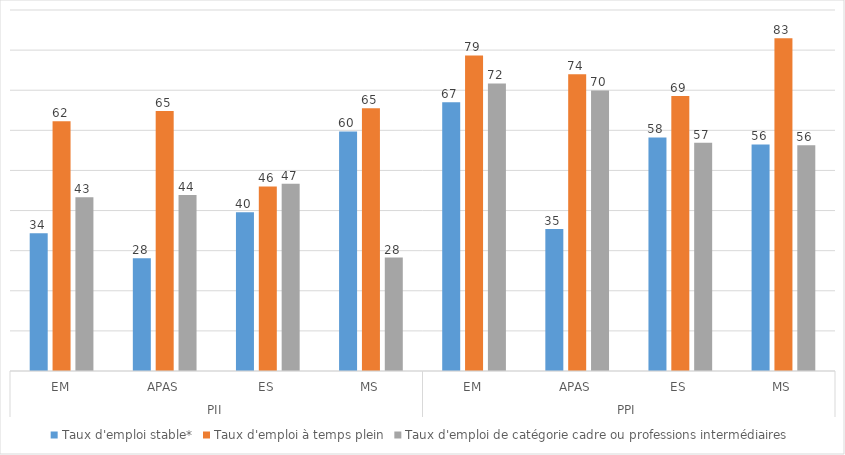
| Category | Taux d'emploi stable* | Taux d'emploi à temps plein | Taux d'emploi de catégorie cadre ou professions intermédiaires |
|---|---|---|---|
| 0 | 34.35 | 62.29 | 43.34 |
| 1 | 28.08 | 64.81 | 43.88 |
| 2 | 39.58 | 46.01 | 46.67 |
| 3 | 59.73 | 65.48 | 28.29 |
| 4 | 67.02 | 78.66 | 71.69 |
| 5 | 35.39 | 73.97 | 69.94 |
| 6 | 58.22 | 68.55 | 56.92 |
| 7 | 56.48 | 82.94 | 56.31 |